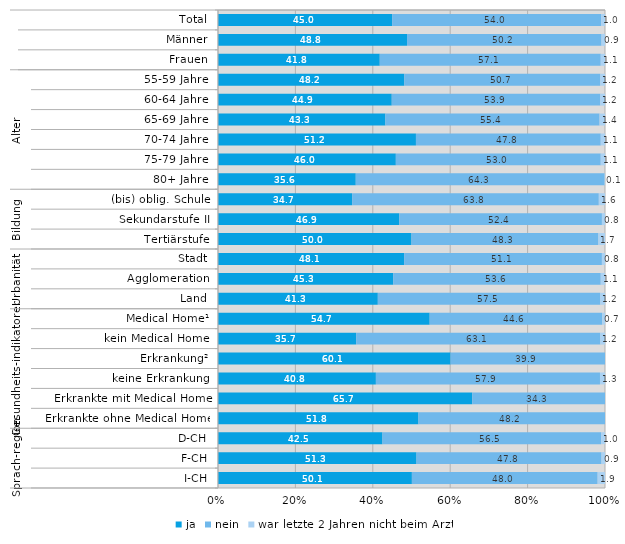
| Category | ja | nein | war letzte 2 Jahren nicht beim Arzt |
|---|---|---|---|
| 0 | 45 | 54 | 1 |
| 1 | 48.8 | 50.2 | 0.9 |
| 2 | 41.8 | 57.1 | 1.1 |
| 3 | 48.2 | 50.7 | 1.2 |
| 4 | 44.9 | 53.9 | 1.2 |
| 5 | 43.3 | 55.4 | 1.4 |
| 6 | 51.2 | 47.8 | 1.1 |
| 7 | 46 | 53 | 1.1 |
| 8 | 35.6 | 64.3 | 0.1 |
| 9 | 34.7 | 63.8 | 1.6 |
| 10 | 46.9 | 52.4 | 0.8 |
| 11 | 50 | 48.3 | 1.7 |
| 12 | 48.1 | 51.1 | 0.8 |
| 13 | 45.3 | 53.6 | 1.1 |
| 14 | 41.3 | 57.5 | 1.2 |
| 15 | 54.7 | 44.6 | 0.7 |
| 16 | 35.7 | 63.1 | 1.2 |
| 17 | 60.1 | 39.9 | 0 |
| 18 | 40.8 | 57.9 | 1.3 |
| 19 | 65.7 | 34.3 | 0 |
| 20 | 51.8 | 48.2 | 0 |
| 21 | 42.5 | 56.5 | 1 |
| 22 | 51.3 | 47.8 | 0.9 |
| 23 | 50.1 | 48 | 1.9 |